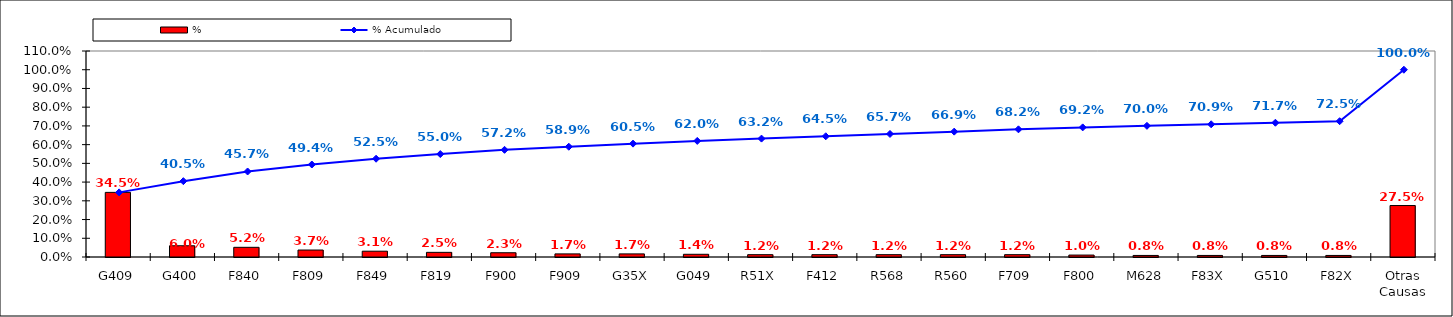
| Category | % |
|---|---|
| G409 | 0.345 |
| G400 | 0.06 |
| F840 | 0.052 |
| F809 | 0.037 |
| F849 | 0.031 |
| F819 | 0.025 |
| F900 | 0.023 |
| F909 | 0.017 |
| G35X | 0.017 |
| G049 | 0.014 |
| R51X | 0.012 |
| F412 | 0.012 |
| R568 | 0.012 |
| R560 | 0.012 |
| F709 | 0.012 |
| F800 | 0.01 |
| M628 | 0.008 |
| F83X | 0.008 |
| G510 | 0.008 |
| F82X | 0.008 |
| Otras Causas | 0.275 |